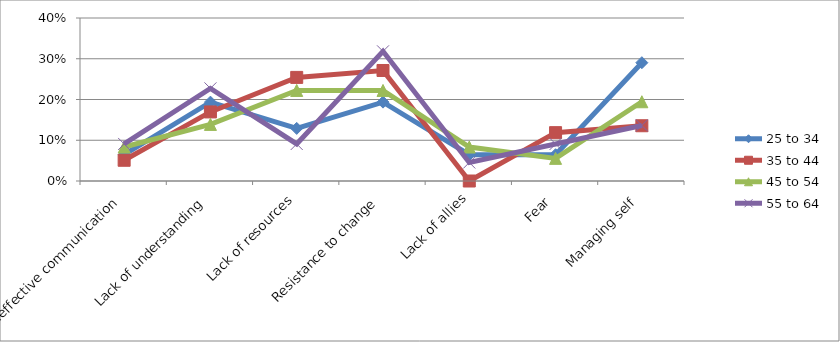
| Category | 25 to 34 | 35 to 44 | 45 to 54 | 55 to 64 |
|---|---|---|---|---|
| Ineffective communication | 0.065 | 0.051 | 0.083 | 0.091 |
| Lack of understanding | 0.194 | 0.169 | 0.139 | 0.227 |
| Lack of resources | 0.129 | 0.254 | 0.222 | 0.091 |
| Resistance to change | 0.194 | 0.271 | 0.222 | 0.318 |
| Lack of allies | 0.065 | 0 | 0.083 | 0.045 |
| Fear | 0.065 | 0.119 | 0.056 | 0.091 |
| Managing self | 0.29 | 0.136 | 0.194 | 0.136 |